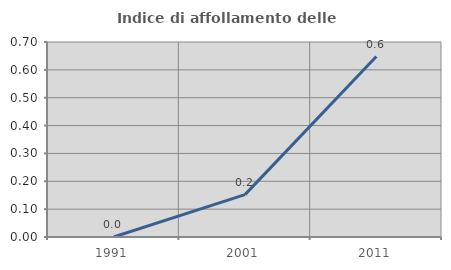
| Category | Indice di affollamento delle abitazioni  |
|---|---|
| 1991.0 | 0 |
| 2001.0 | 0.152 |
| 2011.0 | 0.648 |